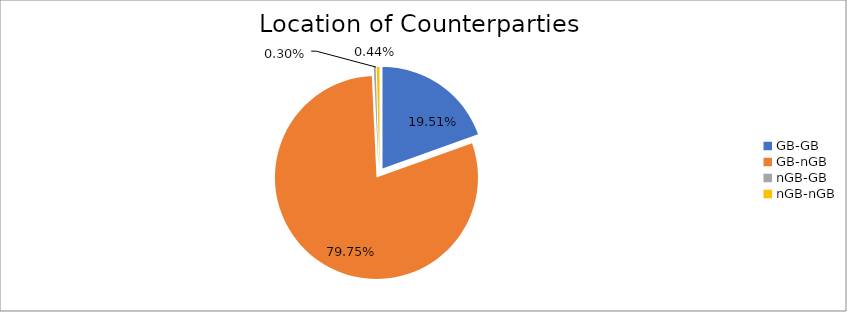
| Category | Series 0 |
|---|---|
| GB-GB | 2096833.879 |
| GB-nGB | 8571713.495 |
| nGB-GB | 32493.766 |
| nGB-nGB | 47217.262 |